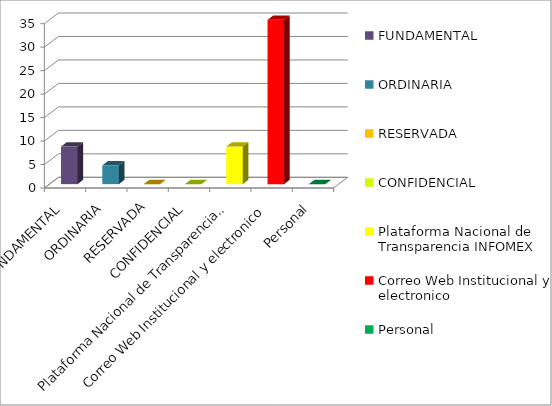
| Category | Series 2 |
|---|---|
| FUNDAMENTAL | 8 |
| ORDINARIA | 4 |
| RESERVADA | 0 |
| CONFIDENCIAL | 0 |
| Plataforma Nacional de Transparencia INFOMEX | 8 |
| Correo Web Institucional y electronico | 35 |
| Personal | 0 |